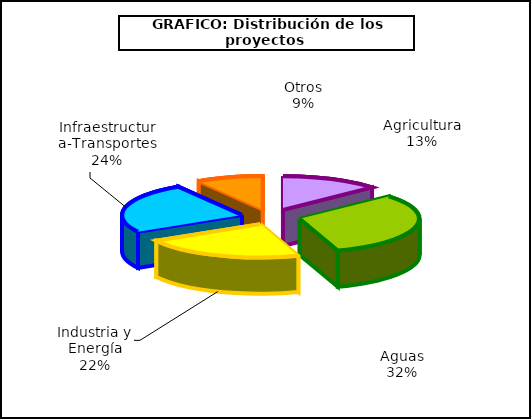
| Category | Series 0 |
|---|---|
| 0 | 1161 |
| 1 | 2751 |
| 2 | 1903 |
| 3 | 2126 |
| 4 | 779 |